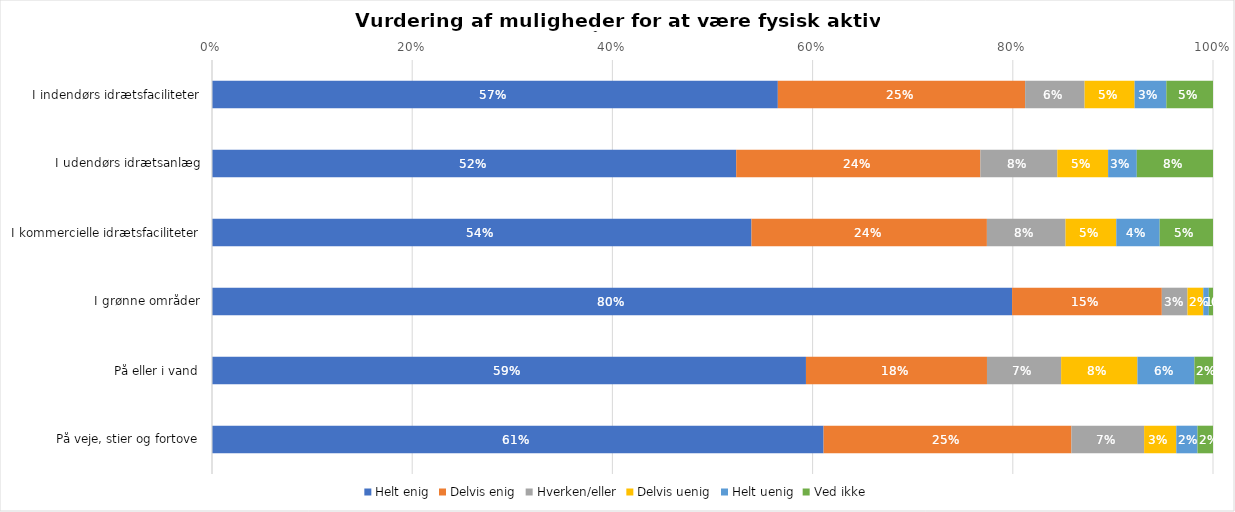
| Category | Helt enig | Delvis enig | Hverken/eller | Delvis uenig | Helt uenig | Ved ikke |
|---|---|---|---|---|---|---|
| I indendørs idrætsfaciliteter | 0.565 | 0.247 | 0.059 | 0.05 | 0.032 | 0.047 |
| I udendørs idrætsanlæg | 0.524 | 0.244 | 0.077 | 0.051 | 0.029 | 0.076 |
| I kommercielle idrætsfaciliteter | 0.539 | 0.235 | 0.079 | 0.051 | 0.043 | 0.053 |
| I grønne områder | 0.799 | 0.15 | 0.026 | 0.016 | 0.006 | 0.004 |
| På eller i vand | 0.593 | 0.181 | 0.074 | 0.076 | 0.057 | 0.019 |
| På veje, stier og fortove | 0.611 | 0.248 | 0.073 | 0.032 | 0.021 | 0.015 |